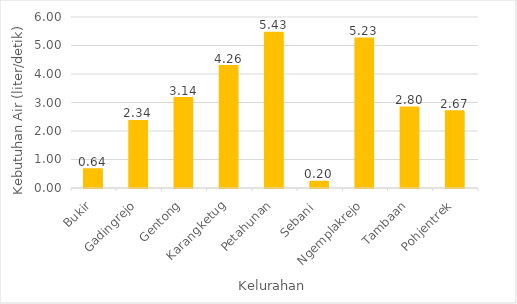
| Category | Kebutuhan Air (liter/detik) |
|---|---|
| Bukir | 0.64 |
| Gadingrejo | 2.335 |
| Gentong | 3.14 |
| Karangketug | 4.262 |
| Petahunan | 5.43 |
| Sebani  | 0.198 |
| Ngemplakrejo | 5.232 |
| Tambaan | 2.804 |
| Pohjentrek | 2.672 |